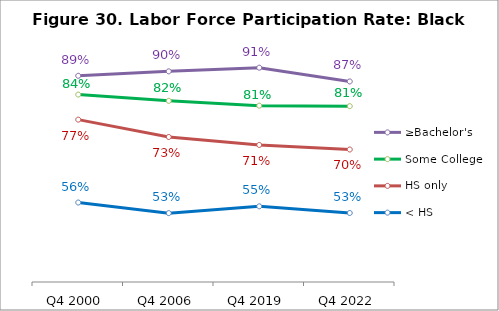
| Category | ≥Bachelor's | Some College | HS only | < HS |
|---|---|---|---|---|
| Q4 2000 | 0.888 | 0.839 | 0.774 | 0.557 |
| Q4 2006 | 0.9 | 0.823 | 0.728 | 0.53 |
| Q4 2019 | 0.909 | 0.81 | 0.708 | 0.547 |
| Q4 2022 | 0.873 | 0.809 | 0.696 | 0.53 |